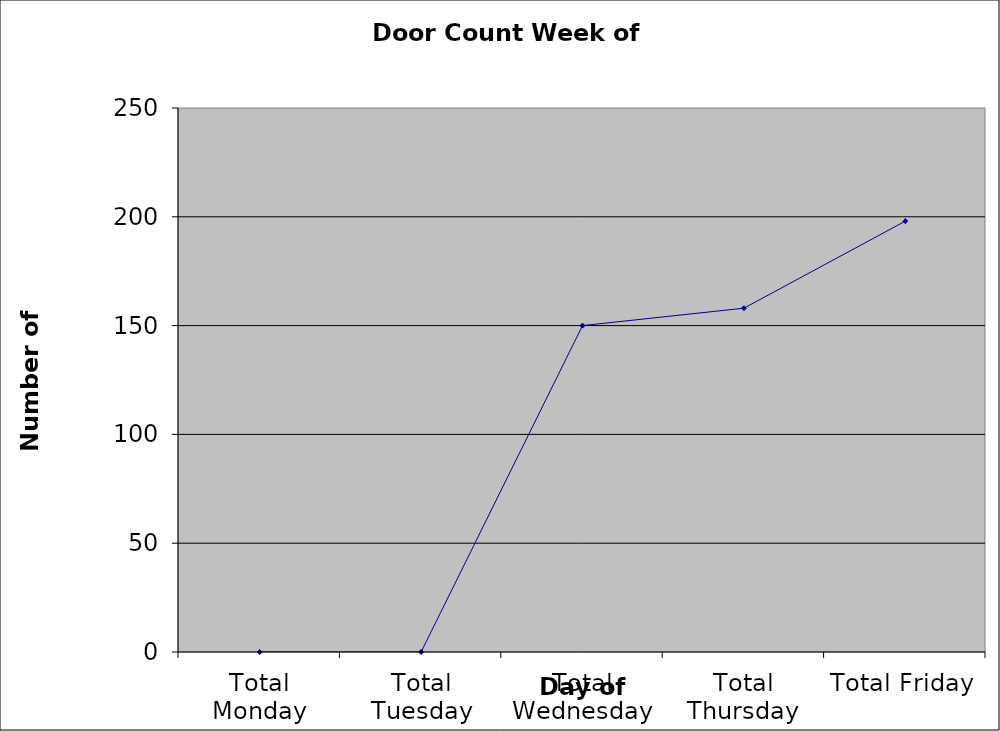
| Category | Series 0 |
|---|---|
| Total Monday | 0 |
| Total Tuesday | 0 |
| Total Wednesday | 150 |
| Total Thursday | 158 |
| Total Friday | 198 |